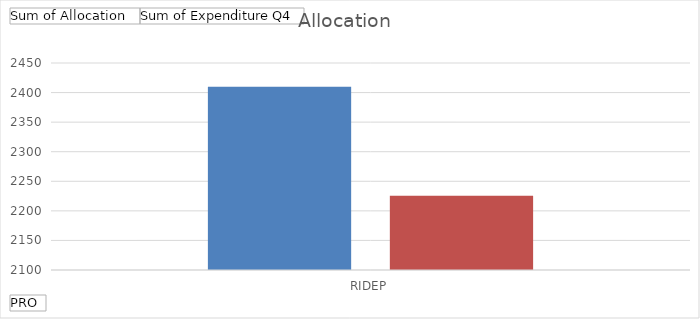
| Category | Sum of Allocation  | Sum of Expenditure Q4 |
|---|---|---|
| RIDEP | 2410 | 2225.64 |